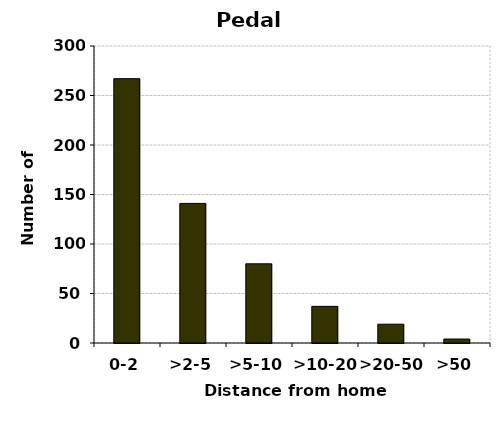
| Category | Pedal cycles |
|---|---|
| 0-2 | 267 |
| >2-5 | 141 |
| >5-10 | 80 |
| >10-20 | 37 |
| >20-50 | 19 |
| >50 | 4 |